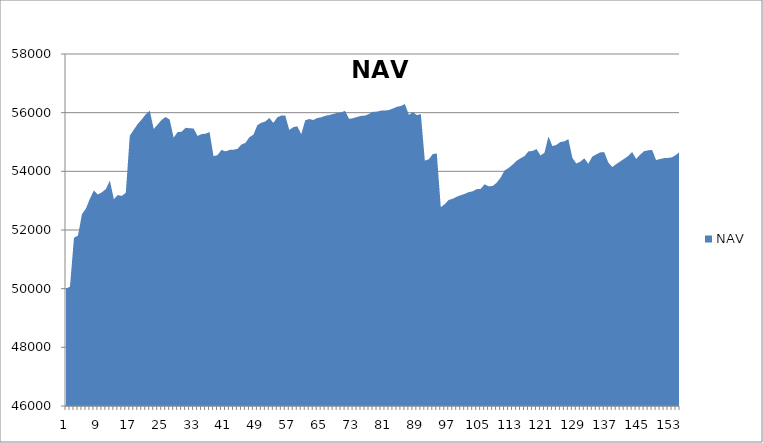
| Category | NAV |
|---|---|
| 0 | 50000 |
| 1 | 50069.444 |
| 2 | 51736.444 |
| 3 | 51809.343 |
| 4 | 52539.343 |
| 5 | 52733.57 |
| 6 | 53070.527 |
| 7 | 53346.212 |
| 8 | 53210.13 |
| 9 | 53285.788 |
| 10 | 53396.685 |
| 11 | 53684.185 |
| 12 | 53050.597 |
| 13 | 53191.058 |
| 14 | 53162.649 |
| 15 | 53270.317 |
| 16 | 55214.762 |
| 17 | 55418.583 |
| 18 | 55617.273 |
| 19 | 55770.477 |
| 20 | 55945.477 |
| 21 | 56069.601 |
| 22 | 55444.601 |
| 23 | 55597.925 |
| 24 | 55757.558 |
| 25 | 55851.308 |
| 26 | 55764.06 |
| 27 | 55148.361 |
| 28 | 55340.028 |
| 29 | 55349.317 |
| 30 | 55485.393 |
| 31 | 55468.704 |
| 32 | 55461.038 |
| 33 | 55205.356 |
| 34 | 55270.356 |
| 35 | 55282.57 |
| 36 | 55341.011 |
| 37 | 54517.482 |
| 38 | 54554.291 |
| 39 | 54731.016 |
| 40 | 54679.093 |
| 41 | 54730.595 |
| 42 | 54736.73 |
| 43 | 54765.085 |
| 44 | 54915.643 |
| 45 | 54969.86 |
| 46 | 55164.665 |
| 47 | 55247.746 |
| 48 | 55575.668 |
| 49 | 55657.905 |
| 50 | 55701.032 |
| 51 | 55819.28 |
| 52 | 55652.834 |
| 53 | 55838.604 |
| 54 | 55905.769 |
| 55 | 55898.888 |
| 56 | 55410.9 |
| 57 | 55504.564 |
| 58 | 55537.603 |
| 59 | 55268.471 |
| 60 | 55737.858 |
| 61 | 55785.708 |
| 62 | 55749.829 |
| 63 | 55815.591 |
| 64 | 55842.34 |
| 65 | 55894.021 |
| 66 | 55916.828 |
| 67 | 55955.697 |
| 68 | 55991.896 |
| 69 | 56012.065 |
| 70 | 56060.293 |
| 71 | 55791.443 |
| 72 | 55810.674 |
| 73 | 55852.843 |
| 74 | 55892.018 |
| 75 | 55900.069 |
| 76 | 55955.739 |
| 77 | 56030.918 |
| 78 | 56036.168 |
| 79 | 56069.975 |
| 80 | 56071.656 |
| 81 | 56090.406 |
| 82 | 56141.798 |
| 83 | 56199.159 |
| 84 | 56228.237 |
| 85 | 56292.573 |
| 86 | 55924.369 |
| 87 | 56019.106 |
| 88 | 55916.165 |
| 89 | 55950.09 |
| 90 | 54367.13 |
| 91 | 54411.811 |
| 92 | 54588.933 |
| 93 | 54611.197 |
| 94 | 52777.117 |
| 95 | 52883.107 |
| 96 | 53025.651 |
| 97 | 53064.908 |
| 98 | 53135.652 |
| 99 | 53186.005 |
| 100 | 53229.789 |
| 101 | 53290.192 |
| 102 | 53319.038 |
| 103 | 53392.112 |
| 104 | 53401.462 |
| 105 | 53559.878 |
| 106 | 53489.526 |
| 107 | 53501.684 |
| 108 | 53607.597 |
| 109 | 53785.178 |
| 110 | 54030.211 |
| 111 | 54113.452 |
| 112 | 54226.272 |
| 113 | 54358.625 |
| 114 | 54444.736 |
| 115 | 54518.421 |
| 116 | 54681.882 |
| 117 | 54693.454 |
| 118 | 54759.719 |
| 119 | 54542.637 |
| 120 | 54631.804 |
| 121 | 55189.582 |
| 122 | 54857.283 |
| 123 | 54902.45 |
| 124 | 54998.878 |
| 125 | 55024.352 |
| 126 | 55097.595 |
| 127 | 54460.788 |
| 128 | 54265.386 |
| 129 | 54330.201 |
| 130 | 54444.032 |
| 131 | 54258.967 |
| 132 | 54502.531 |
| 133 | 54576.689 |
| 134 | 54645.616 |
| 135 | 54655.645 |
| 136 | 54306.491 |
| 137 | 54146.917 |
| 138 | 54245.601 |
| 139 | 54336.218 |
| 140 | 54425.943 |
| 141 | 54524.223 |
| 142 | 54658.516 |
| 143 | 54423.271 |
| 144 | 54567.668 |
| 145 | 54687.668 |
| 146 | 54715.668 |
| 147 | 54729.584 |
| 148 | 54383.43 |
| 149 | 54420.248 |
| 150 | 54450.791 |
| 151 | 54457.1 |
| 152 | 54477.818 |
| 153 | 54563.112 |
| 154 | 54666.053 |